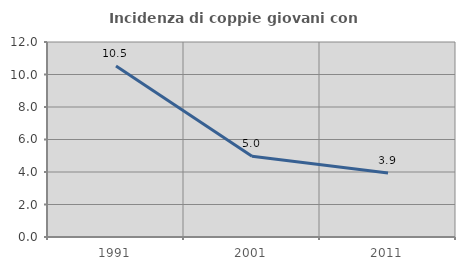
| Category | Incidenza di coppie giovani con figli |
|---|---|
| 1991.0 | 10.526 |
| 2001.0 | 4.969 |
| 2011.0 | 3.933 |